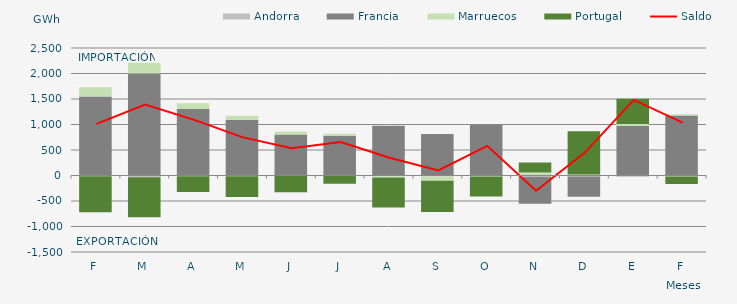
| Category | Andorra | Francia | Marruecos | Portugal |
|---|---|---|---|---|
| F | -15.973 | 1550.723 | 179.304 | -702.278 |
| M | -32.372 | 2000.98 | 212.165 | -788.594 |
| A | -13.98 | 1308.271 | 106.522 | -309.693 |
| M | -12.717 | 1093.205 | 77.107 | -409.795 |
| J | -8.299 | 804.225 | 59.96 | -319.011 |
| J | -1.488 | 777.149 | 40.929 | -159.488 |
| A | -16.745 | 974.066 | -21.389 | -587.13 |
| S | -21.816 | 812.203 | -79.308 | -613.114 |
| O | -14.818 | 993.522 | -4.279 | -393.484 |
| N | -22.557 | -531.947 | 57.949 | 199.161 |
| D | -20.764 | -396.046 | 21.949 | 843.669 |
| E | -24.438 | 973.605 | 35.757 | 497.454 |
| F | -19.197 | 1176.23 | 25.948 | -147.199 |